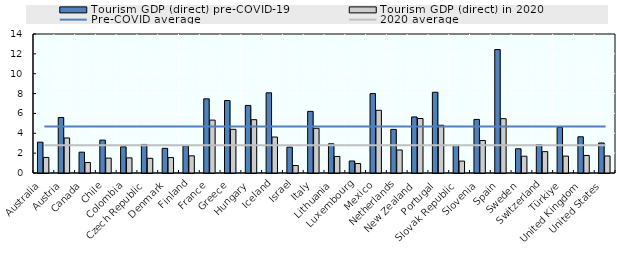
| Category | Tourism GDP (direct) pre-COVID-19 | Tourism GDP (direct) in 2020 |
|---|---|---|
| Australia | 3.104 | 1.568 |
| Austria | 5.587 | 3.529 |
| Canada | 2.096 | 1.058 |
| Chile | 3.314 | 1.5 |
| Colombia | 2.638 | 1.525 |
| Czech Republic | 2.876 | 1.48 |
| Denmark | 2.485 | 1.555 |
| Finland | 2.73 | 1.728 |
| France | 7.47 | 5.329 |
| Greece | 7.3 | 4.4 |
| Hungary | 6.806 | 5.371 |
| Iceland | 8.077 | 3.623 |
| Israel | 2.603 | 0.752 |
| Italy | 6.207 | 4.5 |
| Lithuania | 2.942 | 1.668 |
| Luxembourg | 1.21 | 0.955 |
| Mexico | 8.002 | 6.315 |
| Netherlands | 4.392 | 2.318 |
| New Zealand | 5.646 | 5.488 |
| Portugal | 8.134 | 4.809 |
| Slovak Republic | 2.784 | 1.2 |
| Slovenia | 5.397 | 3.275 |
| Spain | 12.435 | 5.473 |
| Sweden | 2.44 | 1.691 |
| Switzerland | 2.856 | 2.152 |
| Türkiye | 4.6 | 1.7 |
| United Kingdom | 3.649 | 1.766 |
| United States | 3.024 | 1.714 |